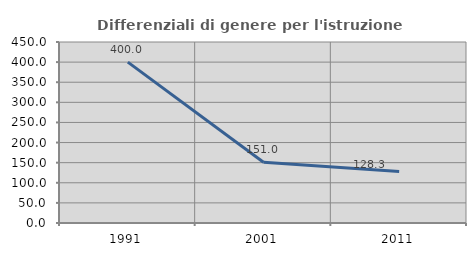
| Category | Differenziali di genere per l'istruzione superiore |
|---|---|
| 1991.0 | 400 |
| 2001.0 | 150.98 |
| 2011.0 | 128.333 |